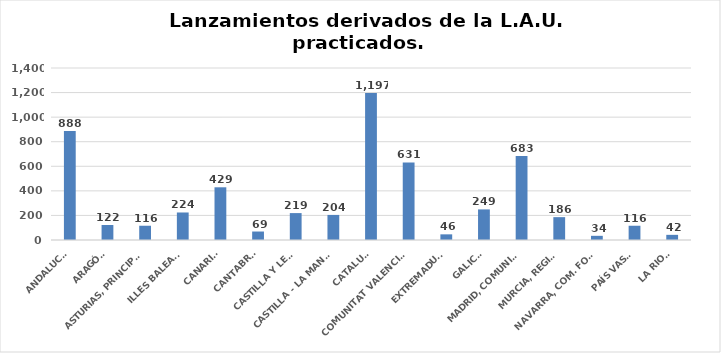
| Category | Series 0 |
|---|---|
| ANDALUCÍA | 888 |
| ARAGÓN | 122 |
| ASTURIAS, PRINCIPADO | 116 |
| ILLES BALEARS | 224 |
| CANARIAS | 429 |
| CANTABRIA | 69 |
| CASTILLA Y LEÓN | 219 |
| CASTILLA - LA MANCHA | 204 |
| CATALUÑA | 1197 |
| COMUNITAT VALENCIANA | 631 |
| EXTREMADURA | 46 |
| GALICIA | 249 |
| MADRID, COMUNIDAD | 683 |
| MURCIA, REGIÓN | 186 |
| NAVARRA, COM. FORAL | 34 |
| PAÍS VASCO | 116 |
| LA RIOJA | 42 |